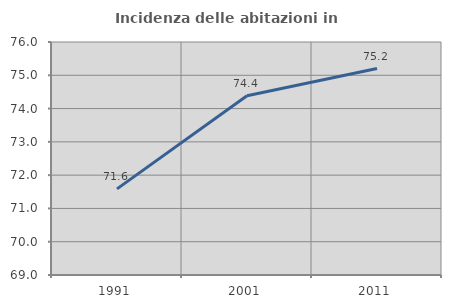
| Category | Incidenza delle abitazioni in proprietà  |
|---|---|
| 1991.0 | 71.587 |
| 2001.0 | 74.382 |
| 2011.0 | 75.202 |